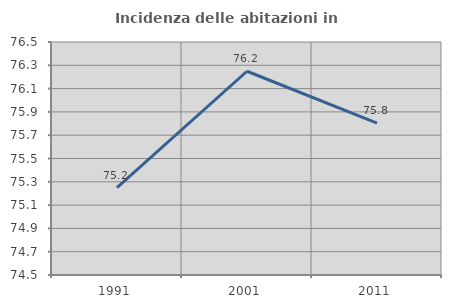
| Category | Incidenza delle abitazioni in proprietà  |
|---|---|
| 1991.0 | 75.25 |
| 2001.0 | 76.249 |
| 2011.0 | 75.803 |